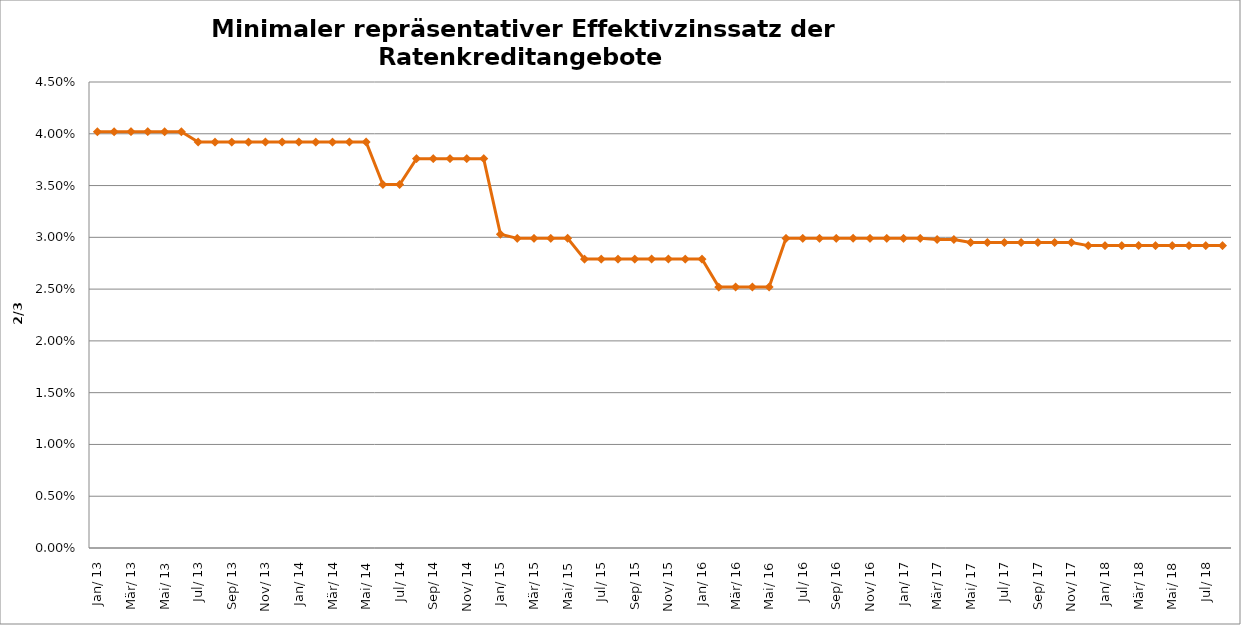
| Category | Series 0 |
|---|---|
| 2013-01-01 | 0.04 |
| 2013-02-01 | 0.04 |
| 2013-03-01 | 0.04 |
| 2013-04-01 | 0.04 |
| 2013-05-01 | 0.04 |
| 2013-06-01 | 0.04 |
| 2013-07-01 | 0.039 |
| 2013-08-01 | 0.039 |
| 2013-09-01 | 0.039 |
| 2013-10-01 | 0.039 |
| 2013-11-01 | 0.039 |
| 2013-12-01 | 0.039 |
| 2014-01-01 | 0.039 |
| 2014-02-01 | 0.039 |
| 2014-03-01 | 0.039 |
| 2014-04-01 | 0.039 |
| 2014-05-01 | 0.039 |
| 2014-06-01 | 0.035 |
| 2014-07-01 | 0.035 |
| 2014-08-01 | 0.038 |
| 2014-09-01 | 0.038 |
| 2014-10-01 | 0.038 |
| 2014-11-01 | 0.038 |
| 2014-12-01 | 0.038 |
| 2015-01-01 | 0.03 |
| 2015-02-01 | 0.03 |
| 2015-03-01 | 0.03 |
| 2015-04-01 | 0.03 |
| 2015-05-01 | 0.03 |
| 2015-06-01 | 0.028 |
| 2015-07-01 | 0.028 |
| 2015-08-01 | 0.028 |
| 2015-09-01 | 0.028 |
| 2015-10-01 | 0.028 |
| 2015-11-01 | 0.028 |
| 2015-12-01 | 0.028 |
| 2016-01-01 | 0.028 |
| 2016-02-01 | 0.025 |
| 2016-03-01 | 0.025 |
| 2016-04-01 | 0.025 |
| 2016-05-01 | 0.025 |
| 2016-06-01 | 0.03 |
| 2016-07-01 | 0.03 |
| 2016-08-01 | 0.03 |
| 2016-09-01 | 0.03 |
| 2016-10-01 | 0.03 |
| 2016-11-01 | 0.03 |
| 2016-12-01 | 0.03 |
| 2017-01-01 | 0.03 |
| 2017-02-01 | 0.03 |
| 2017-03-01 | 0.03 |
| 2017-04-01 | 0.03 |
| 2017-05-01 | 0.03 |
| 2017-06-01 | 0.03 |
| 2017-07-01 | 0.03 |
| 2017-08-01 | 0.03 |
| 2017-09-01 | 0.03 |
| 2017-10-01 | 0.03 |
| 2017-11-01 | 0.03 |
| 2017-12-01 | 0.029 |
| 2018-01-01 | 0.029 |
| 2018-02-01 | 0.029 |
| 2018-03-01 | 0.029 |
| 2018-04-01 | 0.029 |
| 2018-05-01 | 0.029 |
| 2018-06-01 | 0.029 |
| 2018-07-01 | 0.029 |
| 2018-08-01 | 0.029 |